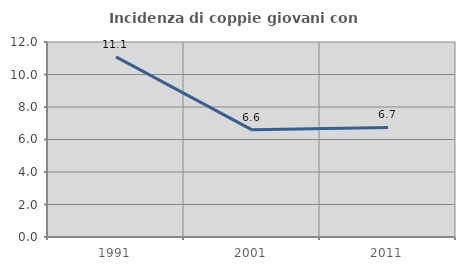
| Category | Incidenza di coppie giovani con figli |
|---|---|
| 1991.0 | 11.081 |
| 2001.0 | 6.596 |
| 2011.0 | 6.739 |